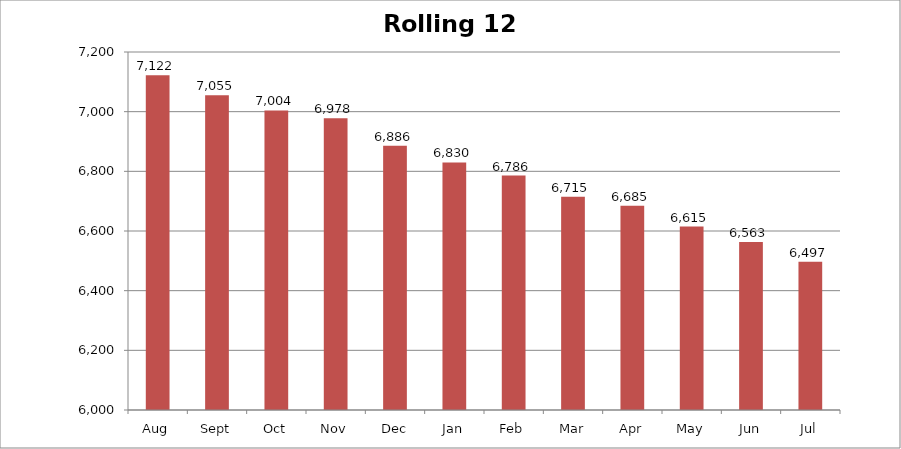
| Category | Rolling 12 Month |
|---|---|
| Aug | 7122 |
| Sept | 7055 |
| Oct | 7004 |
| Nov | 6978 |
| Dec | 6886 |
| Jan | 6830 |
| Feb | 6786 |
| Mar | 6715 |
| Apr | 6685 |
| May | 6615 |
| Jun | 6563 |
| Jul | 6497 |